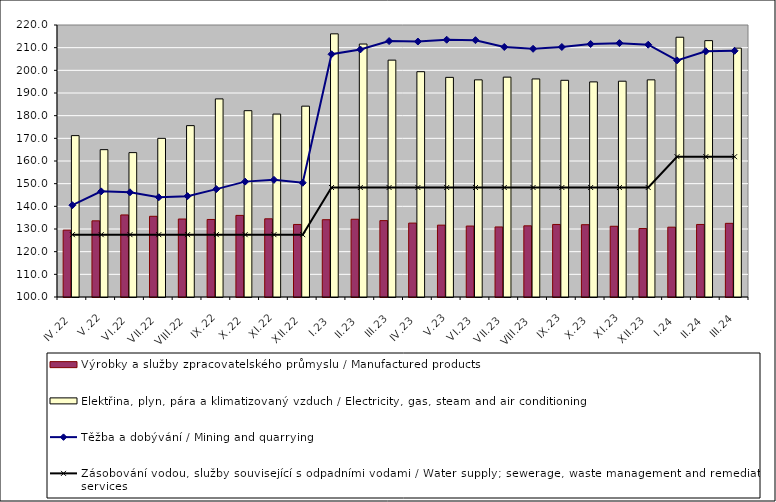
| Category | Výrobky a služby zpracovatelského průmyslu / Manufactured products | Elektřina, plyn, pára a klimatizovaný vzduch / Electricity, gas, steam and air conditioning |
|---|---|---|
| IV.22 | 129.5 | 171.2 |
| V.22 | 133.6 | 165 |
| VI.22 | 136.2 | 163.7 |
| VII.22 | 135.6 | 170 |
| VIII.22 | 134.4 | 175.6 |
| IX.22 | 134.2 | 187.4 |
| X.22 | 136 | 182.2 |
| XI.22 | 134.5 | 180.7 |
| XII.22 | 132 | 184.2 |
| I.23 | 134.1 | 216.1 |
| II.23 | 134.3 | 211.6 |
| III.23 | 133.7 | 204.5 |
| IV.23 | 132.6 | 199.4 |
| V.23 | 131.7 | 196.9 |
| VI.23 | 131.3 | 195.8 |
| VII.23 | 130.9 | 197 |
| VIII.23 | 131.4 | 196.2 |
| IX.23 | 132 | 195.6 |
| X.23 | 131.9 | 194.9 |
| XI.23 | 131.2 | 195.2 |
| XII.23 | 130.2 | 195.8 |
| I.24 | 130.8 | 214.6 |
| II.24 | 132 | 213.1 |
| III.24 | 132.5 | 209.8 |